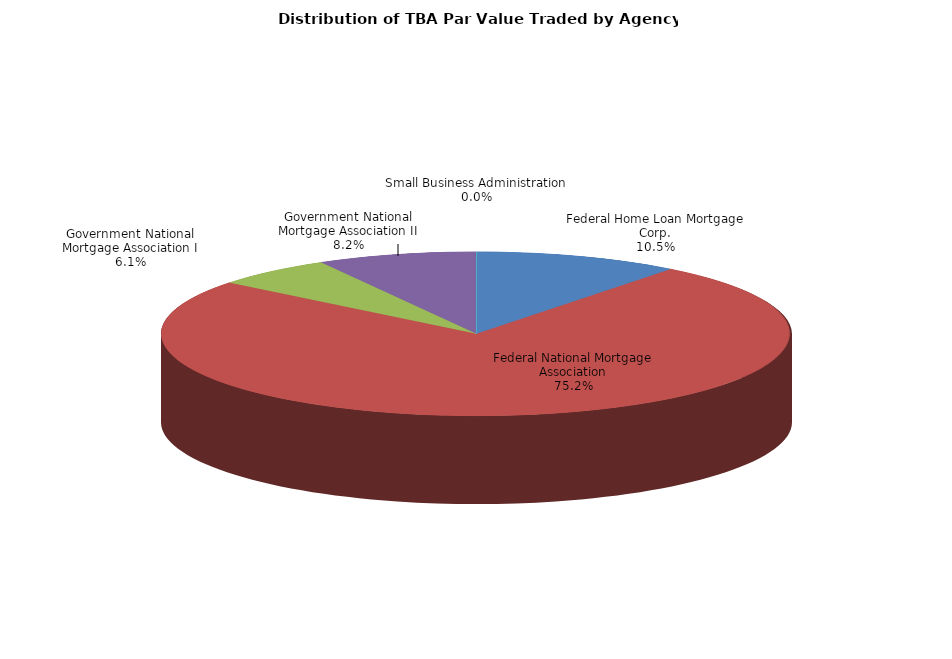
| Category | Series 0 |
|---|---|
| Federal Home Loan Mortgage Corp. | 21950349990.55 |
| Federal National Mortgage Association | 156850452439.555 |
| Government National Mortgage Association I | 12712764091.335 |
| Government National Mortgage Association II | 17046540126.192 |
| Small Business Administration | 7514048.135 |